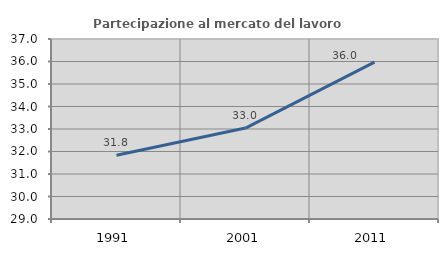
| Category | Partecipazione al mercato del lavoro  femminile |
|---|---|
| 1991.0 | 31.837 |
| 2001.0 | 33.041 |
| 2011.0 | 35.973 |